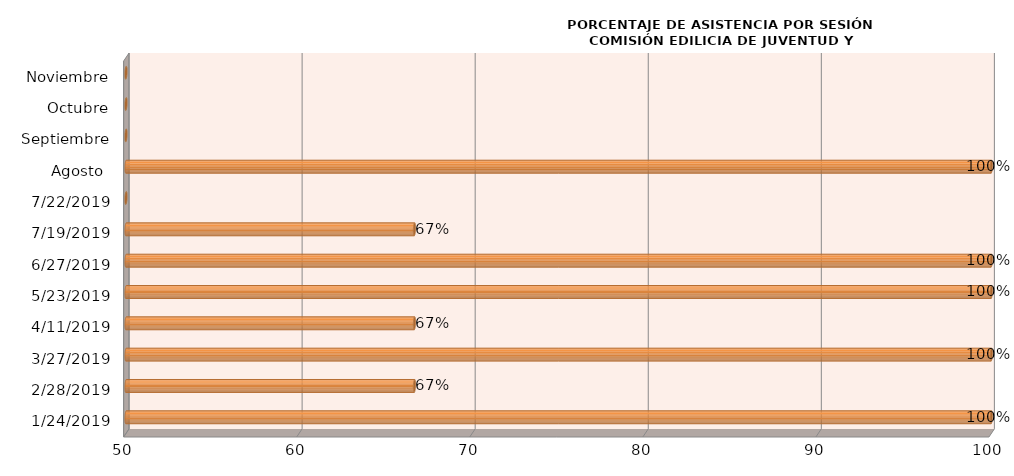
| Category | Series 0 |
|---|---|
| 24/01/2019 | 100 |
| 28/02/2019 | 66.667 |
| 27/03/2019 | 100 |
| 11/04/2019 | 66.667 |
| 23/05/2019 | 100 |
| 27/06/2019 | 100 |
| 19/07/2019 | 66.667 |
| 22/07/2019 | 0 |
| Agosto  | 100 |
| Septiembre | 0 |
| Octubre | 0 |
| Noviembre | 0 |